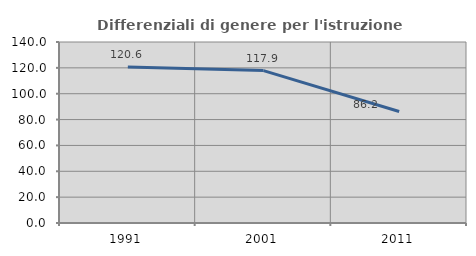
| Category | Differenziali di genere per l'istruzione superiore |
|---|---|
| 1991.0 | 120.593 |
| 2001.0 | 117.901 |
| 2011.0 | 86.247 |